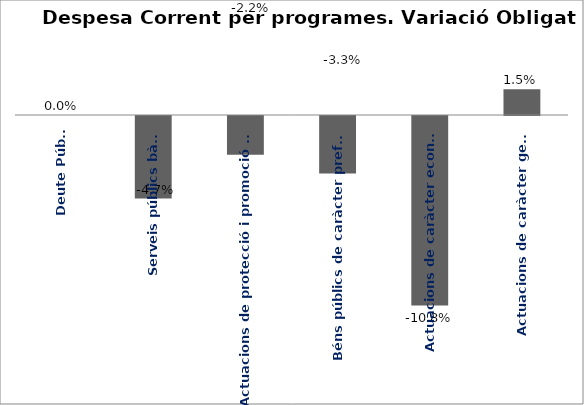
| Category | Series 0 |
|---|---|
| Deute Públic | 0 |
| Serveis públics bàsics | -0.047 |
| Actuacions de protecció i promoció social | -0.022 |
| Béns públics de caràcter preferent | -0.033 |
| Actuacions de caràcter econòmic | -0.108 |
| Actuacions de caràcter general | 0.015 |